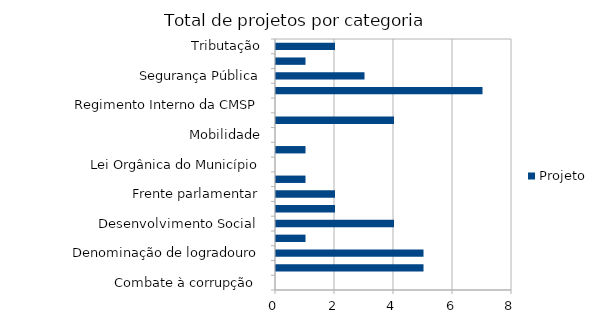
| Category | Projeto |
|---|---|
| Combate à corrupção  | 0 |
| Datas comemorativas e homenagens diversas | 5 |
| Denominação de logradouro | 5 |
| Desenvolvimento Econômico | 1 |
| Desenvolvimento Social  | 4 |
| Educação e cultura | 2 |
| Frente parlamentar | 2 |
| Habitação e Urbanismo | 1 |
| Lei Orgânica do Município | 0 |
| Meio ambiente ,  | 1 |
| Mobilidade | 0 |
| Proteção dos animais | 4 |
| Regimento Interno da CMSP | 0 |
| Saude-Esporte | 7 |
| Segurança Pública | 3 |
| Transparencia | 1 |
| Tributação | 2 |